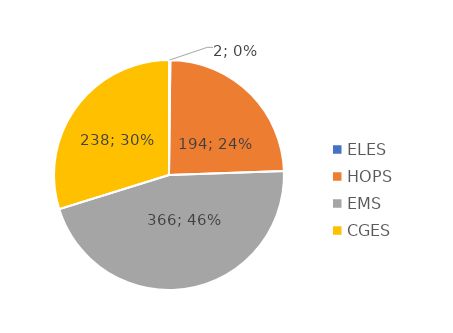
| Category | Series 0 |
|---|---|
| ELES | 1.5 |
| HOPS | 194 |
| EMS | 366 |
| CGES | 238.333 |